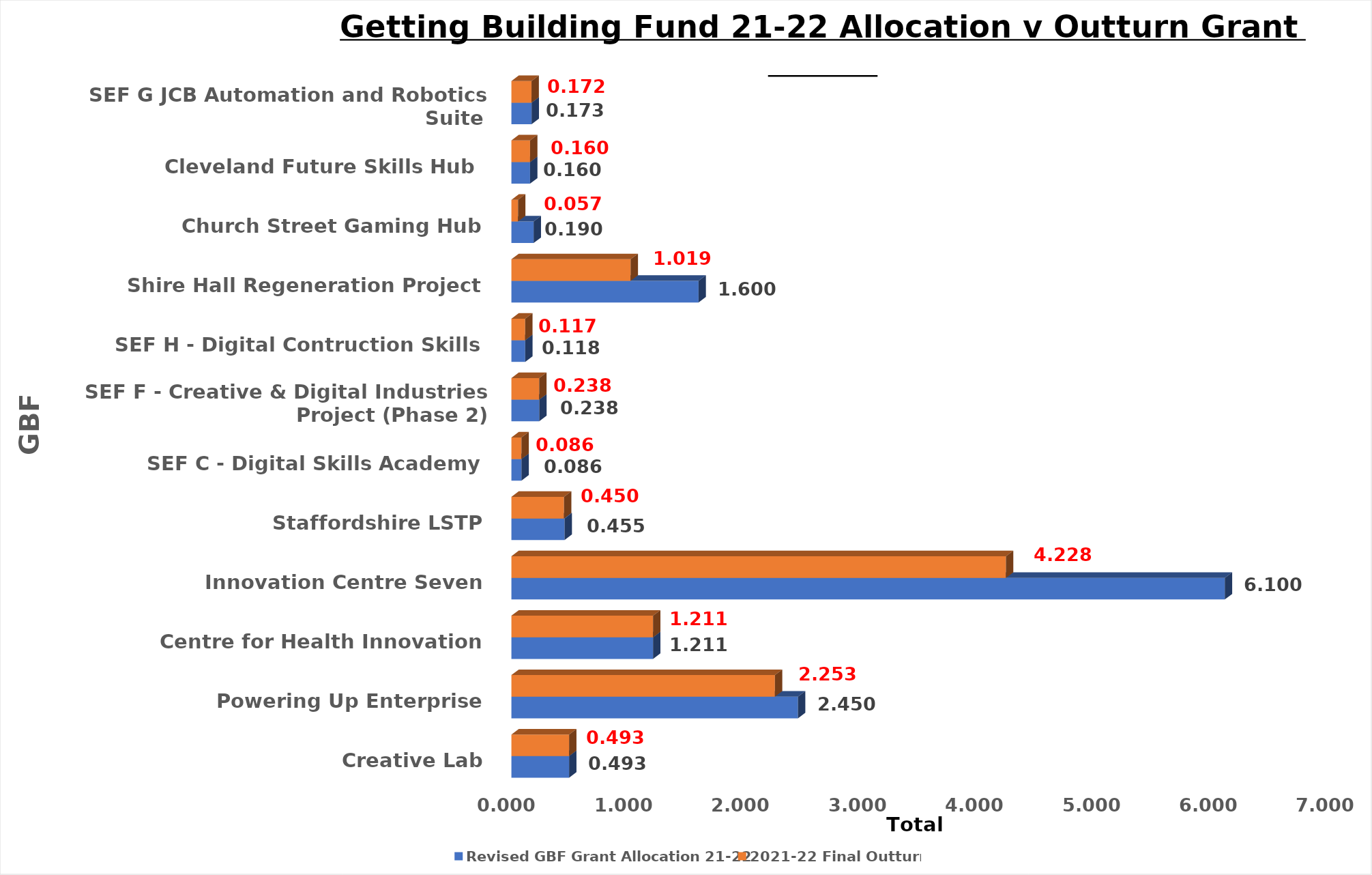
| Category | Revised GBF Grant Allocation 21-22 | 2021-22 Final Outturn |
|---|---|---|
| Creative Lab | 0.493 | 0.493 |
| Powering Up Enterprise | 2.45 | 2.253 |
| Centre for Health Innovation | 1.211 | 1.211 |
| Innovation Centre Seven | 6.1 | 4.228 |
| Staffordshire LSTP | 0.455 | 0.45 |
| SEF C - Digital Skills Academy | 0.086 | 0.086 |
| SEF F - Creative & Digital Industries Project (Phase 2) | 0.238 | 0.238 |
| SEF H - Digital Contruction Skills | 0.118 | 0.117 |
| Shire Hall Regeneration Project | 1.6 | 1.019 |
| Church Street Gaming Hub | 0.19 | 0.057 |
| Cleveland Future Skills Hub  | 0.16 | 0.16 |
| SEF G JCB Automation and Robotics Suite  | 0.173 | 0.172 |